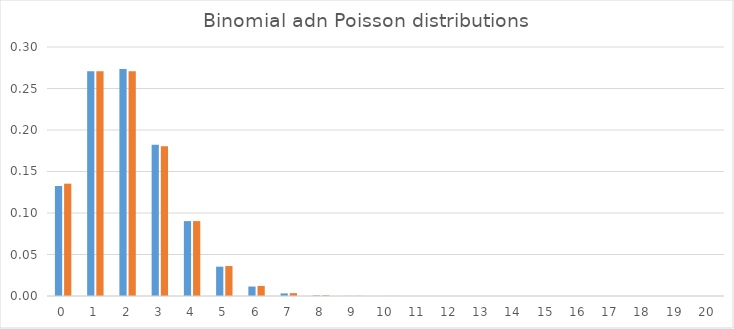
| Category | Binom | Poisson |
|---|---|---|
| 0.0 | 0.133 | 0.135 |
| 1.0 | 0.271 | 0.271 |
| 2.0 | 0.273 | 0.271 |
| 3.0 | 0.182 | 0.18 |
| 4.0 | 0.09 | 0.09 |
| 5.0 | 0.035 | 0.036 |
| 6.0 | 0.011 | 0.012 |
| 7.0 | 0.003 | 0.003 |
| 8.0 | 0.001 | 0.001 |
| 9.0 | 0 | 0 |
| 10.0 | 0 | 0 |
| 11.0 | 0 | 0 |
| 12.0 | 0 | 0 |
| 13.0 | 0 | 0 |
| 14.0 | 0 | 0 |
| 15.0 | 0 | 0 |
| 16.0 | 0 | 0 |
| 17.0 | 0 | 0 |
| 18.0 | 0 | 0 |
| 19.0 | 0 | 0 |
| 20.0 | 0 | 0 |